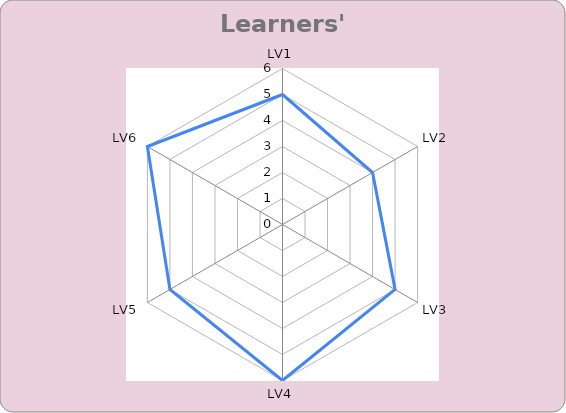
| Category | Series 0 |
|---|---|
| LV1 | 5 |
| LV2 | 4 |
| LV3 | 5 |
| LV4 | 6 |
| LV5 | 5 |
| LV6 | 6 |